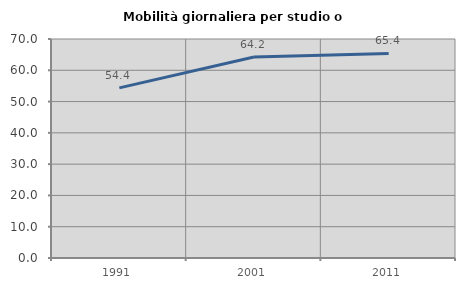
| Category | Mobilità giornaliera per studio o lavoro |
|---|---|
| 1991.0 | 54.38 |
| 2001.0 | 64.232 |
| 2011.0 | 65.397 |